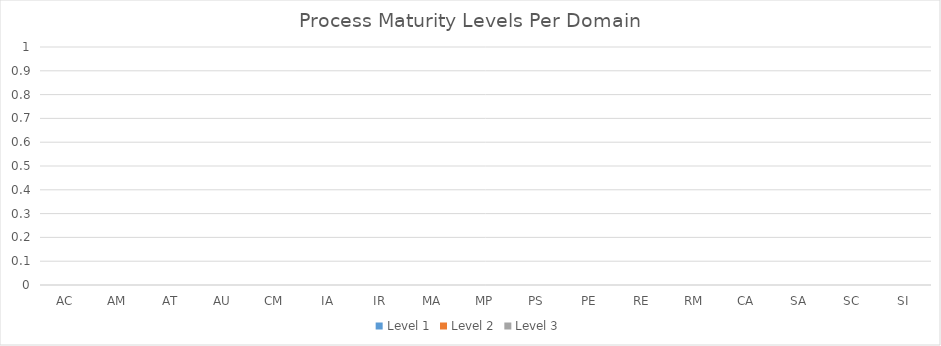
| Category | Level 1 | Level 2 | Level 3 |
|---|---|---|---|
| AC | 0 | 0 | 0 |
| AM | 0 | 0 | 0 |
| AT | 0 | 0 | 0 |
| AU | 0 | 0 | 0 |
| CM | 0 | 0 | 0 |
| IA | 0 | 0 | 0 |
| IR | 0 | 0 | 0 |
| MA | 0 | 0 | 0 |
| MP | 0 | 0 | 0 |
| PS | 0 | 0 | 0 |
| PE | 0 | 0 | 0 |
| RE | 0 | 0 | 0 |
| RM | 0 | 0 | 0 |
| CA | 0 | 0 | 0 |
| SA | 0 | 0 | 0 |
| SC | 0 | 0 | 0 |
| SI | 0 | 0 | 0 |